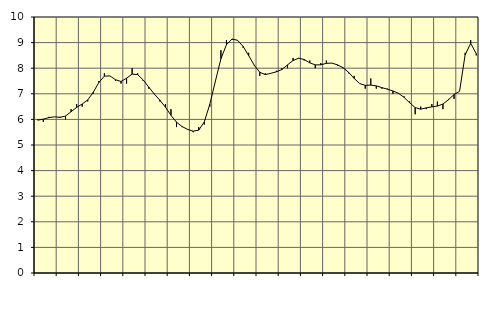
| Category | Piggar | Series 1 |
|---|---|---|
| nan | 6 | 5.97 |
| 1.0 | 5.9 | 6.01 |
| 1.0 | 6.1 | 6.07 |
| 1.0 | 6.1 | 6.1 |
| nan | 6.1 | 6.08 |
| 2.0 | 6 | 6.13 |
| 2.0 | 6.4 | 6.3 |
| 2.0 | 6.6 | 6.47 |
| nan | 6.5 | 6.6 |
| 3.0 | 6.7 | 6.76 |
| 3.0 | 7 | 7.06 |
| 3.0 | 7.5 | 7.44 |
| nan | 7.8 | 7.69 |
| 4.0 | 7.7 | 7.7 |
| 4.0 | 7.5 | 7.55 |
| 4.0 | 7.4 | 7.48 |
| nan | 7.4 | 7.61 |
| 5.0 | 8 | 7.77 |
| 5.0 | 7.8 | 7.75 |
| 5.0 | 7.5 | 7.54 |
| nan | 7.2 | 7.26 |
| 6.0 | 7 | 6.99 |
| 6.0 | 6.7 | 6.75 |
| 6.0 | 6.6 | 6.48 |
| nan | 6.4 | 6.16 |
| 7.0 | 5.7 | 5.89 |
| 7.0 | 5.7 | 5.72 |
| 7.0 | 5.6 | 5.61 |
| nan | 5.5 | 5.54 |
| 8.0 | 5.7 | 5.58 |
| 8.0 | 5.8 | 5.9 |
| 8.0 | 6.5 | 6.59 |
| nan | 7.5 | 7.49 |
| 9.0 | 8.7 | 8.37 |
| 9.0 | 9.1 | 8.92 |
| 9.0 | 9.1 | 9.14 |
| nan | 9.1 | 9.09 |
| 10.0 | 8.8 | 8.85 |
| 10.0 | 8.6 | 8.49 |
| 10.0 | 8.1 | 8.12 |
| nan | 7.7 | 7.84 |
| 11.0 | 7.8 | 7.75 |
| 11.0 | 7.8 | 7.8 |
| 11.0 | 7.9 | 7.86 |
| nan | 8 | 7.95 |
| 12.0 | 8 | 8.13 |
| 12.0 | 8.4 | 8.3 |
| 12.0 | 8.4 | 8.39 |
| nan | 8.3 | 8.34 |
| 13.0 | 8.3 | 8.21 |
| 13.0 | 8 | 8.13 |
| 13.0 | 8.2 | 8.13 |
| nan | 8.3 | 8.19 |
| 14.0 | 8.2 | 8.2 |
| 14.0 | 8.1 | 8.13 |
| 14.0 | 8 | 8.02 |
| nan | 7.8 | 7.84 |
| 15.0 | 7.7 | 7.6 |
| 15.0 | 7.4 | 7.4 |
| 15.0 | 7.2 | 7.33 |
| nan | 7.6 | 7.34 |
| 16.0 | 7.2 | 7.31 |
| 16.0 | 7.2 | 7.24 |
| 16.0 | 7.2 | 7.18 |
| nan | 7 | 7.11 |
| 17.0 | 7 | 7.02 |
| 17.0 | 6.9 | 6.86 |
| 17.0 | 6.7 | 6.65 |
| nan | 6.2 | 6.46 |
| 18.0 | 6.5 | 6.4 |
| 18.0 | 6.4 | 6.45 |
| 18.0 | 6.6 | 6.49 |
| nan | 6.7 | 6.52 |
| 19.0 | 6.4 | 6.6 |
| 19.0 | 6.8 | 6.77 |
| 19.0 | 6.8 | 6.97 |
| nan | 7.1 | 7.1 |
| 20.0 | 8.6 | 8.52 |
| 20.0 | 9.1 | 8.97 |
| 20.0 | 8.5 | 8.57 |